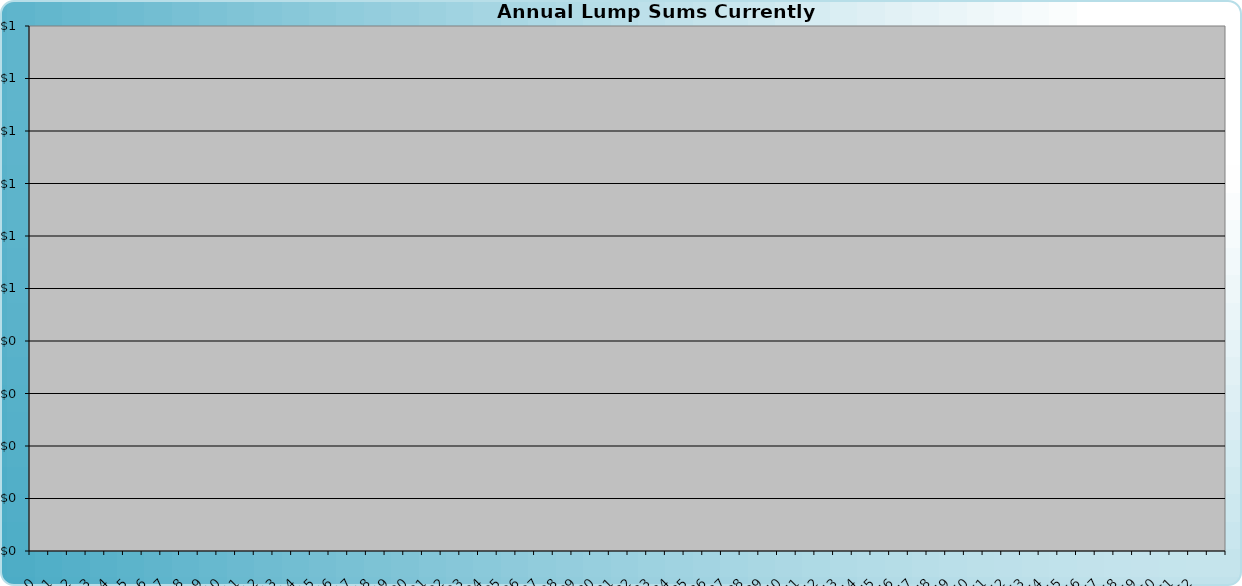
| Category | Amount of Funds Available to Meet All Needs |
|---|---|
| 0.0 | 0 |
| 1.0 | 0 |
| 2.0 | 0 |
| 3.0 | 0 |
| 4.0 | 0 |
| 5.0 | 0 |
| 6.0 | 0 |
| 7.0 | 0 |
| 8.0 | 0 |
| 9.0 | 0 |
| 10.0 | 0 |
| 11.0 | 0 |
| 12.0 | 0 |
| 13.0 | 0 |
| 14.0 | 0 |
| 15.0 | 0 |
| 16.0 | 0 |
| 17.0 | 0 |
| 18.0 | 0 |
| 19.0 | 0 |
| 20.0 | 0 |
| 21.0 | 0 |
| 22.0 | 0 |
| 23.0 | 0 |
| 24.0 | 0 |
| 25.0 | 0 |
| 26.0 | 0 |
| 27.0 | 0 |
| 28.0 | 0 |
| 29.0 | 0 |
| 30.0 | 0 |
| 31.0 | 0 |
| 32.0 | 0 |
| 33.0 | 0 |
| 34.0 | 0 |
| 35.0 | 0 |
| 36.0 | 0 |
| 37.0 | 0 |
| 38.0 | 0 |
| 39.0 | 0 |
| 40.0 | 0 |
| 41.0 | 0 |
| 42.0 | 0 |
| 43.0 | 0 |
| 44.0 | 0 |
| 45.0 | 0 |
| 46.0 | 0 |
| 47.0 | 0 |
| 48.0 | 0 |
| 49.0 | 0 |
| 50.0 | 0 |
| 51.0 | 0 |
| 52.0 | 0 |
| 53.0 | 0 |
| 54.0 | 0 |
| 55.0 | 0 |
| 56.0 | 0 |
| 57.0 | 0 |
| 58.0 | 0 |
| 59.0 | 0 |
| 60.0 | 0 |
| 61.0 | 0 |
| 62.0 | 0 |